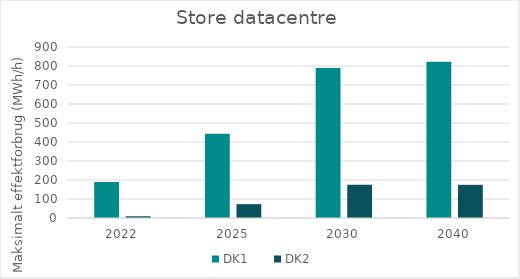
| Category | DK1 | DK2 |
|---|---|---|
| 2022.0 | 189.744 | 9.062 |
| 2025.0 | 443.87 | 72.937 |
| 2030.0 | 790.068 | 175 |
| 2040.0 | 822.746 | 174.522 |